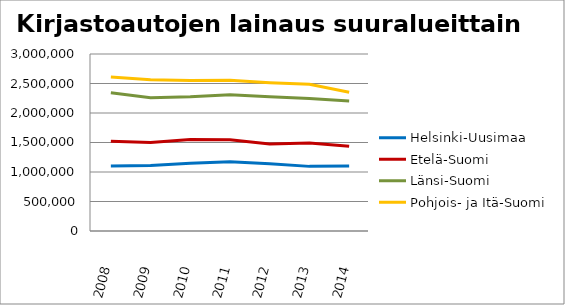
| Category | Helsinki-Uusimaa | Etelä-Suomi | Länsi-Suomi | Pohjois- ja Itä-Suomi |
|---|---|---|---|---|
| 2008.0 | 1102743 | 1521669 | 2342448 | 2611258 |
| 2009.0 | 1112006 | 1499455 | 2258365 | 2563578 |
| 2010.0 | 1146904 | 1550560 | 2274826 | 2548932 |
| 2011.0 | 1172977 | 1545792 | 2307605 | 2554089 |
| 2012.0 | 1141743 | 1473336 | 2276392 | 2514621 |
| 2013.0 | 1095375 | 1493543 | 2243909 | 2488438 |
| 2014.0 | 1101717 | 1436313 | 2201590 | 2350541 |